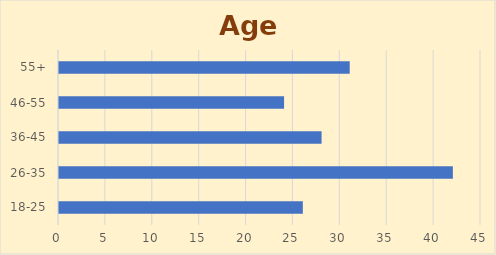
| Category | Series 0 |
|---|---|
| 18-25 | 26 |
| 26-35 | 42 |
| 36-45 | 28 |
| 46-55 | 24 |
| 55+ | 31 |